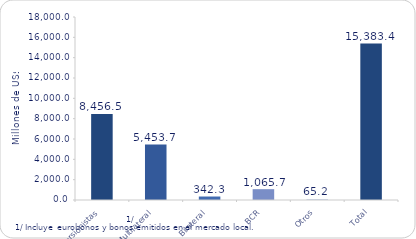
| Category | Series 1 |
|---|---|
| Inversionistas | 8456.5 |
| Multilateral | 5453.7 |
| Bilateral | 342.3 |
| BCR | 1065.7 |
| Otros | 65.2 |
| Total | 15383.4 |